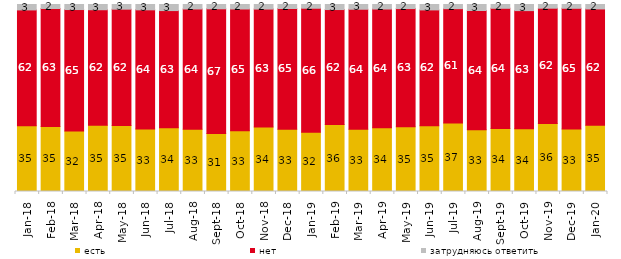
| Category | есть | нет | затрудняюсь ответить |
|---|---|---|---|
| 2018-01-01 | 35.2 | 61.9 | 2.9 |
| 2018-02-01 | 34.8 | 63.05 | 2.15 |
| 2018-03-01 | 32.35 | 64.95 | 2.7 |
| 2018-04-01 | 35.45 | 61.75 | 2.8 |
| 2018-05-01 | 35.3 | 62.15 | 2.5 |
| 2018-06-01 | 33.45 | 63.7 | 2.85 |
| 2018-07-01 | 34.05 | 62.7 | 3.25 |
| 2018-08-01 | 33.3 | 64.3 | 2.4 |
| 2018-09-01 | 31 | 66.7 | 2.3 |
| 2018-10-01 | 32.55 | 65.05 | 2.4 |
| 2018-11-01 | 34.431 | 63.124 | 2.445 |
| 2018-12-01 | 33.25 | 64.6 | 2.15 |
| 2019-01-01 | 31.75 | 66.25 | 2 |
| 2019-02-01 | 35.8 | 61.5 | 2.7 |
| 2019-03-01 | 33.317 | 64.147 | 2.536 |
| 2019-04-01 | 34.059 | 63.515 | 2.426 |
| 2019-05-01 | 34.621 | 63.2 | 2.179 |
| 2019-06-01 | 35.162 | 61.945 | 2.893 |
| 2019-07-01 | 36.634 | 61.139 | 2.228 |
| 2019-08-01 | 33.067 | 63.736 | 3.197 |
| 2019-09-01 | 33.713 | 64.257 | 2.03 |
| 2019-10-01 | 33.564 | 63.168 | 3.267 |
| 2019-11-01 | 36.337 | 61.683 | 1.98 |
| 2019-12-01 | 33.416 | 64.554 | 2.03 |
| 2020-01-01 | 35.446 | 62.178 | 2.376 |